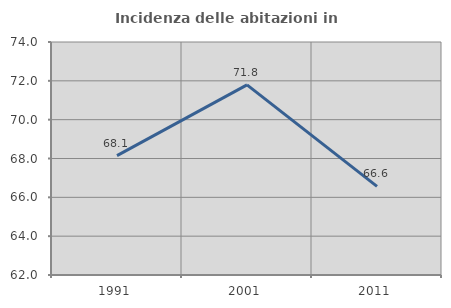
| Category | Incidenza delle abitazioni in proprietà  |
|---|---|
| 1991.0 | 68.148 |
| 2001.0 | 71.794 |
| 2011.0 | 66.562 |